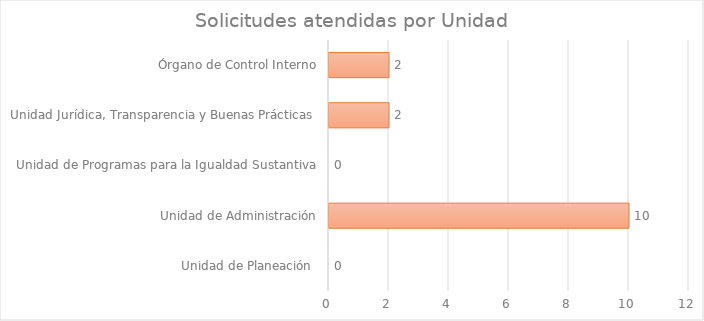
| Category | Series 1 |
|---|---|
| Unidad de Planeación  | 0 |
| Unidad de Administración | 10 |
| Unidad de Programas para la Igualdad Sustantiva | 0 |
| Unidad Jurídica, Transparencia y Buenas Prácticas  | 2 |
| Órgano de Control Interno | 2 |